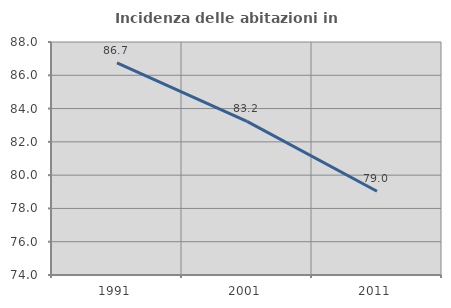
| Category | Incidenza delle abitazioni in proprietà  |
|---|---|
| 1991.0 | 86.74 |
| 2001.0 | 83.234 |
| 2011.0 | 79.032 |